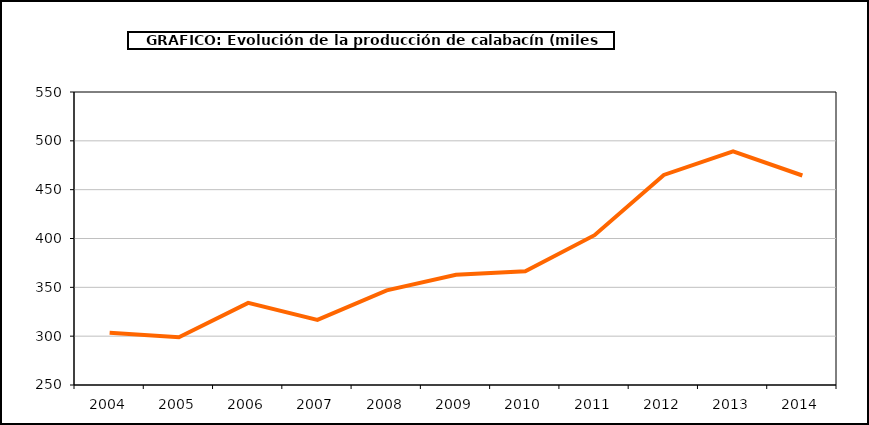
| Category | producción |
|---|---|
| 2004.0 | 303.542 |
| 2005.0 | 298.961 |
| 2006.0 | 334.043 |
| 2007.0 | 316.725 |
| 2008.0 | 346.959 |
| 2009.0 | 362.773 |
| 2010.0 | 366.498 |
| 2011.0 | 403.38 |
| 2012.0 | 465.039 |
| 2013.0 | 489.297 |
| 2014.0 | 464.496 |